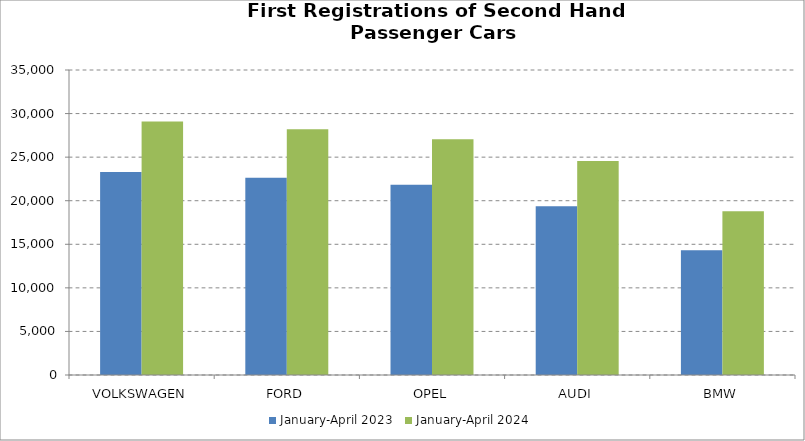
| Category | January-April 2023 | January-April 2024 |
|---|---|---|
| VOLKSWAGEN | 23301 | 29079 |
| FORD | 22632 | 28192 |
| OPEL | 21832 | 27062 |
| AUDI | 19368 | 24555 |
| BMW | 14306 | 18803 |